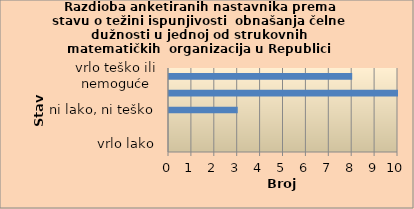
| Category | Series 0 |
|---|---|
| vrlo lako | 0 |
| lako | 0 |
| ni lako, ni teško | 3 |
| teško | 10 |
| vrlo teško ili nemoguće | 8 |